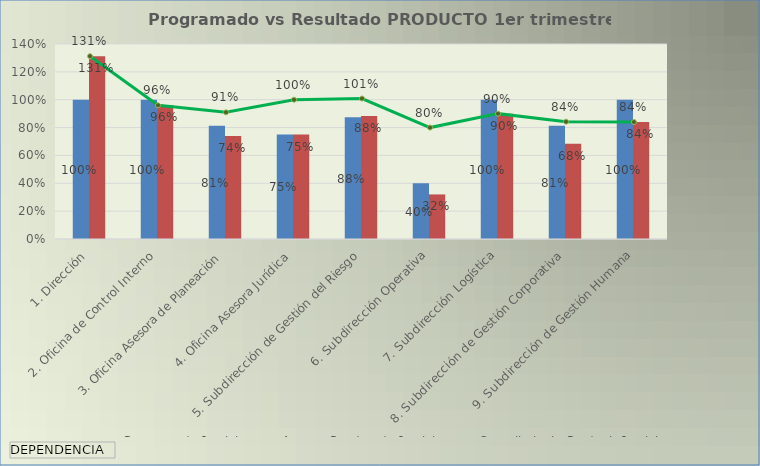
| Category | Programado 1er tri. | Avance Ponderado 1er tri. |
|---|---|---|
| 1. Dirección | 1 | 1.312 |
| 2. Oficina de Control Interno | 1 | 0.96 |
| 3. Oficina Asesora de Planeación | 0.812 | 0.739 |
| 4. Oficina Asesora Jurídica | 0.75 | 0.75 |
| 5. Subdirección de Gestión del Riesgo | 0.875 | 0.882 |
| 6. Subdirección Operativa | 0.4 | 0.32 |
| 7. Subdirección Logística | 1 | 0.9 |
| 8. Subdirección de Gestión Corporativa | 0.812 | 0.684 |
| 9. Subdirección de Gestión Humana | 1 | 0.84 |